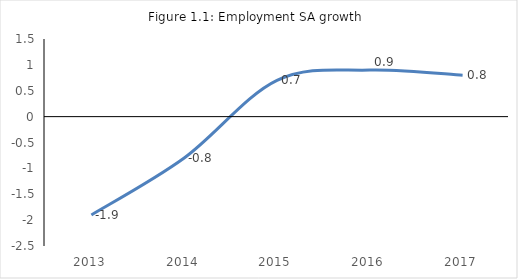
| Category | Employment SA (persons, Statistical Service) |
|---|---|
| 2013.0 | -1.9 |
| 2014.0 | -0.8 |
| 2015.0 | 0.7 |
| 2016.0 | 0.9 |
| 2017.0 | 0.8 |